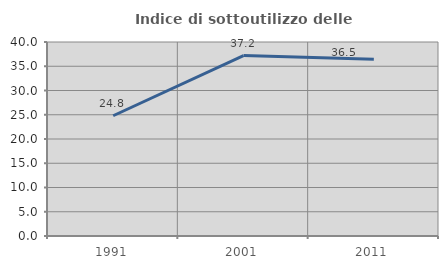
| Category | Indice di sottoutilizzo delle abitazioni  |
|---|---|
| 1991.0 | 24.796 |
| 2001.0 | 37.203 |
| 2011.0 | 36.455 |